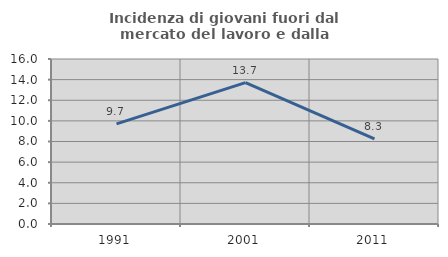
| Category | Incidenza di giovani fuori dal mercato del lavoro e dalla formazione  |
|---|---|
| 1991.0 | 9.707 |
| 2001.0 | 13.712 |
| 2011.0 | 8.26 |